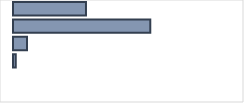
| Category | Series 0 |
|---|---|
| 0 | 32.147 |
| 1 | 60.475 |
| 2 | 6.21 |
| 3 | 1.168 |
| 4 | 0 |